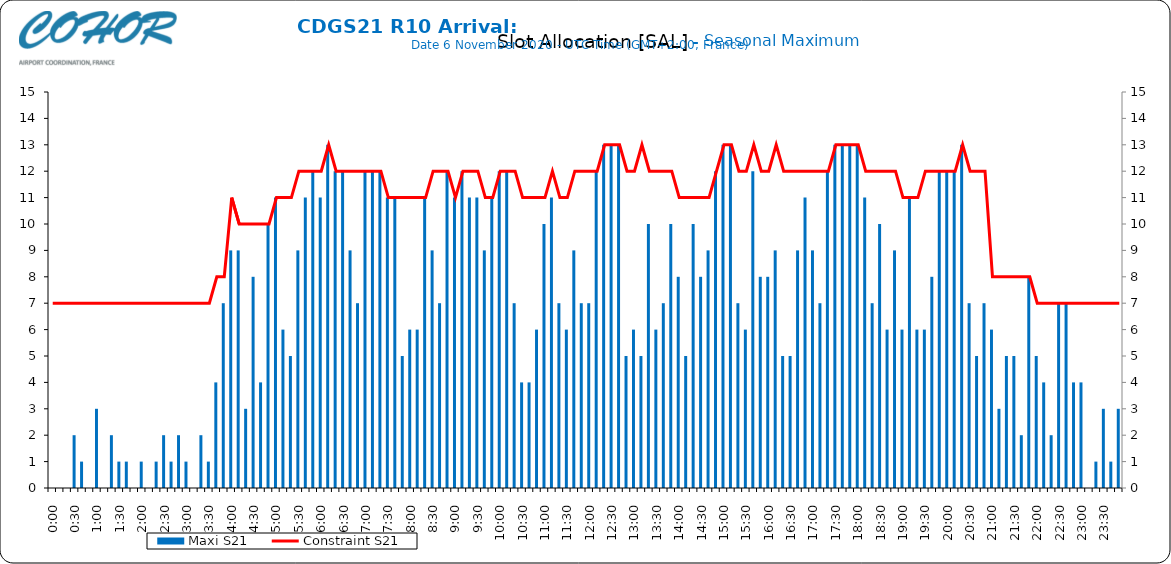
| Category | Maxi S21 |
|---|---|
| 0.0 | 0 |
| 0.006944444444444444 | 0 |
| 0.013888888888888888 | 0 |
| 0.020833333333333332 | 2 |
| 0.027777777777777776 | 1 |
| 0.034722222222222224 | 0 |
| 0.041666666666666664 | 3 |
| 0.04861111111111111 | 0 |
| 0.05555555555555555 | 2 |
| 0.0625 | 1 |
| 0.06944444444444443 | 1 |
| 0.0763888888888889 | 0 |
| 0.08333333333333333 | 1 |
| 0.09027777777777778 | 0 |
| 0.09722222222222222 | 1 |
| 0.10416666666666667 | 2 |
| 0.1111111111111111 | 1 |
| 0.11805555555555557 | 2 |
| 0.125 | 1 |
| 0.13194444444444445 | 0 |
| 0.1388888888888889 | 2 |
| 0.14583333333333334 | 1 |
| 0.15277777777777776 | 4 |
| 0.15972222222222224 | 7 |
| 0.16666666666666666 | 9 |
| 0.17361111111111113 | 9 |
| 0.18055555555555555 | 3 |
| 0.1875 | 8 |
| 0.19444444444444445 | 4 |
| 0.20138888888888887 | 10 |
| 0.20833333333333334 | 11 |
| 0.2152777777777778 | 6 |
| 0.2222222222222222 | 5 |
| 0.22916666666666666 | 9 |
| 0.23611111111111113 | 11 |
| 0.24305555555555555 | 12 |
| 0.25 | 11 |
| 0.2569444444444445 | 13 |
| 0.2638888888888889 | 12 |
| 0.2708333333333333 | 12 |
| 0.2777777777777778 | 9 |
| 0.2847222222222222 | 7 |
| 0.2916666666666667 | 12 |
| 0.2986111111111111 | 12 |
| 0.3055555555555555 | 12 |
| 0.3125 | 11 |
| 0.3194444444444445 | 11 |
| 0.3263888888888889 | 5 |
| 0.3333333333333333 | 6 |
| 0.34027777777777773 | 6 |
| 0.34722222222222227 | 11 |
| 0.3541666666666667 | 9 |
| 0.3611111111111111 | 7 |
| 0.3680555555555556 | 12 |
| 0.375 | 11 |
| 0.3819444444444444 | 12 |
| 0.3888888888888889 | 11 |
| 0.3958333333333333 | 11 |
| 0.40277777777777773 | 9 |
| 0.40972222222222227 | 11 |
| 0.4166666666666667 | 12 |
| 0.4236111111111111 | 12 |
| 0.4305555555555556 | 7 |
| 0.4375 | 4 |
| 0.4444444444444444 | 4 |
| 0.4513888888888889 | 6 |
| 0.4583333333333333 | 10 |
| 0.46527777777777773 | 11 |
| 0.47222222222222227 | 7 |
| 0.4791666666666667 | 6 |
| 0.4861111111111111 | 9 |
| 0.4930555555555556 | 7 |
| 0.5 | 7 |
| 0.5069444444444444 | 12 |
| 0.513888888888889 | 13 |
| 0.5208333333333334 | 13 |
| 0.5277777777777778 | 13 |
| 0.5347222222222222 | 5 |
| 0.5416666666666666 | 6 |
| 0.548611111111111 | 5 |
| 0.5555555555555556 | 10 |
| 0.5625 | 6 |
| 0.5694444444444444 | 7 |
| 0.576388888888889 | 10 |
| 0.5833333333333334 | 8 |
| 0.5902777777777778 | 5 |
| 0.5972222222222222 | 10 |
| 0.6041666666666666 | 8 |
| 0.611111111111111 | 9 |
| 0.6180555555555556 | 12 |
| 0.625 | 13 |
| 0.6319444444444444 | 13 |
| 0.638888888888889 | 7 |
| 0.6458333333333334 | 6 |
| 0.6527777777777778 | 12 |
| 0.6597222222222222 | 8 |
| 0.6666666666666666 | 8 |
| 0.6736111111111112 | 9 |
| 0.6805555555555555 | 5 |
| 0.6875 | 5 |
| 0.6944444444444445 | 9 |
| 0.7013888888888888 | 11 |
| 0.7083333333333334 | 9 |
| 0.7152777777777778 | 7 |
| 0.7222222222222222 | 12 |
| 0.7291666666666666 | 13 |
| 0.7361111111111112 | 13 |
| 0.7430555555555555 | 13 |
| 0.75 | 13 |
| 0.7569444444444445 | 11 |
| 0.7638888888888888 | 7 |
| 0.7708333333333334 | 10 |
| 0.7777777777777778 | 6 |
| 0.7847222222222222 | 9 |
| 0.7916666666666666 | 6 |
| 0.7986111111111112 | 11 |
| 0.8055555555555555 | 6 |
| 0.8125 | 6 |
| 0.8194444444444445 | 8 |
| 0.8263888888888888 | 12 |
| 0.8333333333333334 | 12 |
| 0.8402777777777778 | 12 |
| 0.8472222222222222 | 13 |
| 0.8541666666666666 | 7 |
| 0.8611111111111112 | 5 |
| 0.8680555555555555 | 7 |
| 0.875 | 6 |
| 0.8819444444444445 | 3 |
| 0.8888888888888888 | 5 |
| 0.8958333333333334 | 5 |
| 0.9027777777777778 | 2 |
| 0.9097222222222222 | 8 |
| 0.9166666666666666 | 5 |
| 0.9236111111111112 | 4 |
| 0.9305555555555555 | 2 |
| 0.9375 | 7 |
| 0.9444444444444445 | 7 |
| 0.9513888888888888 | 4 |
| 0.9583333333333334 | 4 |
| 0.9652777777777778 | 0 |
| 0.9722222222222222 | 1 |
| 0.9791666666666666 | 3 |
| 0.9861111111111112 | 1 |
| 0.9930555555555555 | 3 |